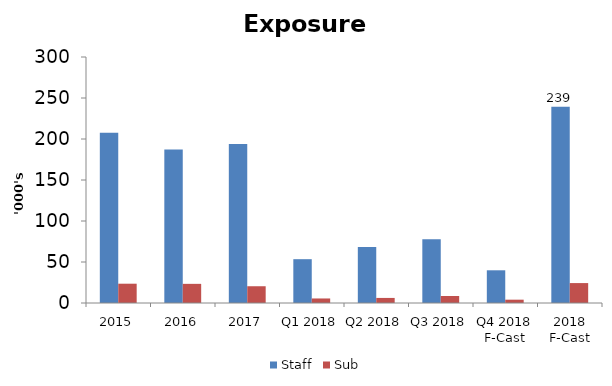
| Category | Staff | Sub |
|---|---|---|
| 2015 | 207536 | 23530 |
| 2016 | 187194 | 23350 |
| 2017 | 193983 | 20442 |
| Q1 2018 | 53430 | 5531 |
| Q2 2018 | 68218 | 6179 |
| Q3 2018 | 77774 | 8539 |
| Q4 2018 F-Cast | 39884.4 | 4049.8 |
| 2018 F-Cast | 239306.4 | 24298.8 |